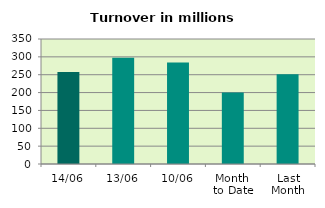
| Category | Series 0 |
|---|---|
| 14/06 | 257.597 |
| 13/06 | 297.665 |
| 10/06 | 283.862 |
| Month 
to Date | 200.072 |
| Last
Month | 251.573 |